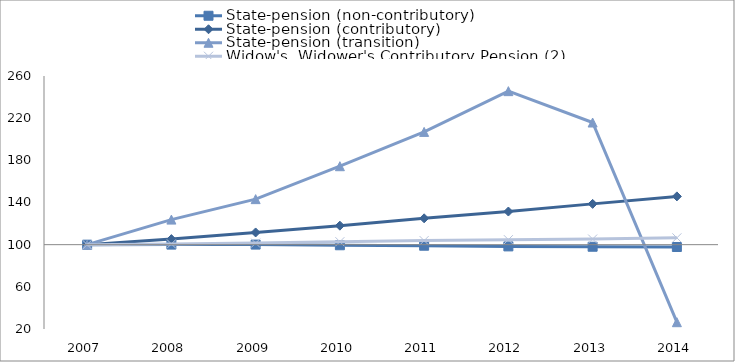
| Category | State-pension (non-contributory) | State-pension (contributory) | State-pension (transition) | Widow's, Widower's Contributory Pension (2) | 0 |
|---|---|---|---|---|---|
| 2007.0 | 100 | 100 | 100 | 100 |  |
| 2008.0 | 100.059 | 105.269 | 123.774 | 100.697 |  |
| 2009.0 | 100.074 | 111.575 | 143.189 | 101.479 |  |
| 2010.0 | 99.44 | 118.022 | 174.432 | 102.798 |  |
| 2011.0 | 99 | 124.998 | 206.973 | 103.86 |  |
| 2012.0 | 98.363 | 131.446 | 245.633 | 104.747 |  |
| 2013.0 | 98.03 | 138.692 | 215.861 | 105.345 |  |
| 2014.0 | 97.794 | 145.8 | 26.457 | 106.469 |  |